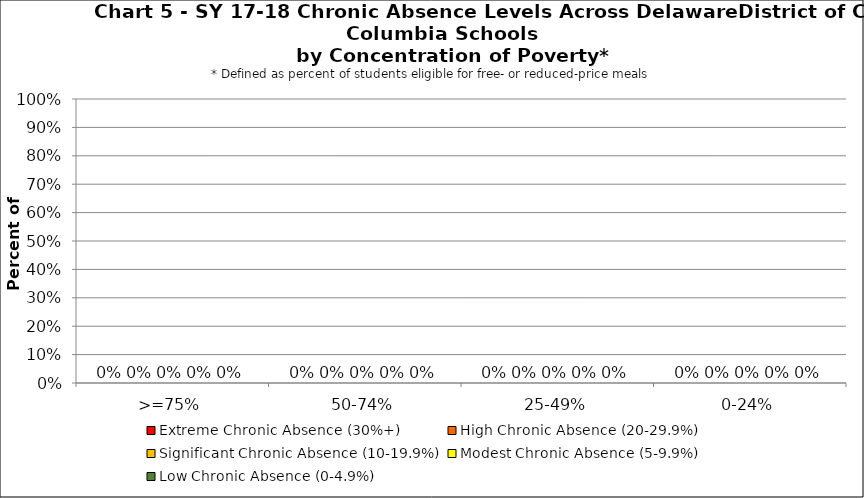
| Category | Extreme Chronic Absence (30%+) | High Chronic Absence (20-29.9%) | Significant Chronic Absence (10-19.9%) | Modest Chronic Absence (5-9.9%) | Low Chronic Absence (0-4.9%) |
|---|---|---|---|---|---|
| 0 | 0 | 0 | 0 | 0 | 0 |
| 1 | 0 | 0 | 0 | 0 | 0 |
| 2 | 0 | 0 | 0 | 0 | 0 |
| 3 | 0 | 0 | 0 | 0 | 0 |